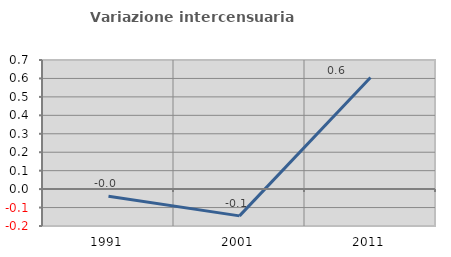
| Category | Variazione intercensuaria annua |
|---|---|
| 1991.0 | -0.039 |
| 2001.0 | -0.145 |
| 2011.0 | 0.605 |